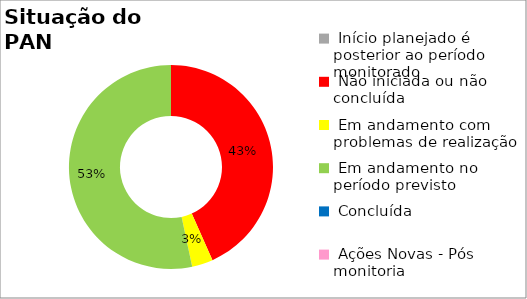
| Category | Series 0 |
|---|---|
|  Início planejado é posterior ao período monitorado | 0 |
|  Não iniciada ou não concluída | 0.433 |
|  Em andamento com problemas de realização | 0.033 |
|  Em andamento no período previsto  | 0.533 |
|  Concluída | 0 |
|  Ações Novas - Pós monitoria | 0 |